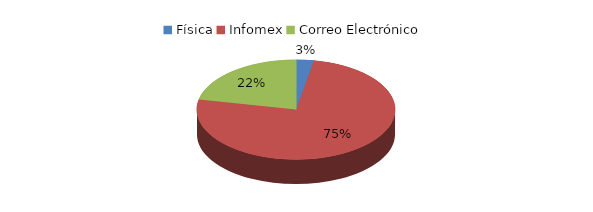
| Category | Series 0 | Series 1 | Series 2 | Series 3 |
|---|---|---|---|---|
| Física | 2 | 0 | 0 | 0 |
| Infomex | 52 | 13 | 2 | 1 |
| Correo Electrónico | 15 | 16 | 3 | 0 |